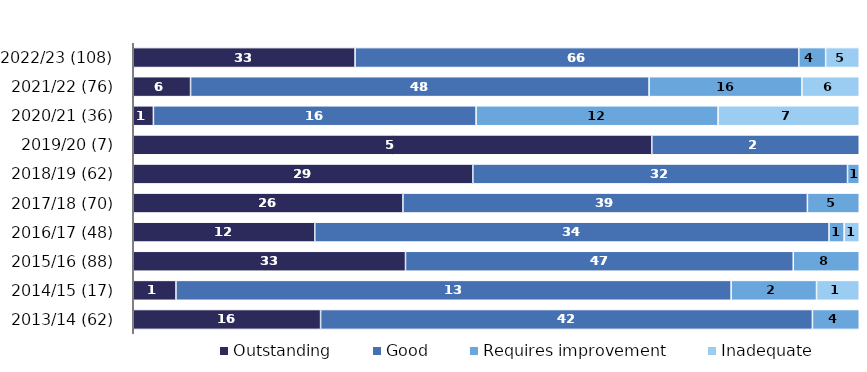
| Category | Outstanding | Good | Requires improvement | Inadequate |
|---|---|---|---|---|
| 2022/23 (108) | 33 | 66 | 4 | 5 |
| 2021/22 (76) | 6 | 48 | 16 | 6 |
| 2020/21 (36) | 1 | 16 | 12 | 7 |
| 2019/20 (7) | 5 | 2 | 0 | 0 |
| 2018/19 (62) | 29 | 32 | 1 | 0 |
| 2017/18 (70) | 26 | 39 | 5 | 0 |
| 2016/17 (48) | 12 | 34 | 1 | 1 |
| 2015/16 (88) | 33 | 47 | 8 | 0 |
| 2014/15 (17) | 1 | 13 | 2 | 1 |
| 2013/14 (62) | 16 | 42 | 4 | 0 |